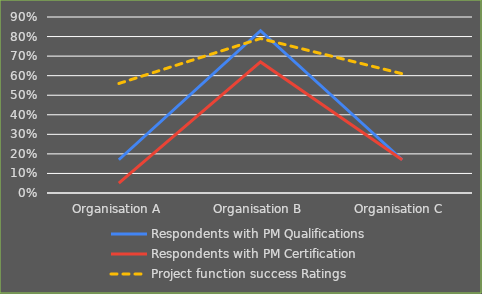
| Category | Respondents with PM Qualifications | Respondents with PM Certification | Project function success Ratings |
|---|---|---|---|
| Organisation A | 0.17 | 0.05 | 0.56 |
| Organisation B | 0.83 | 0.67 | 0.79 |
| Organisation C | 0.17 | 0.17 | 0.61 |